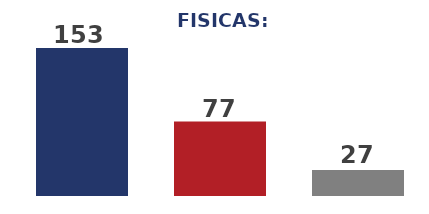
| Category | Series 0 |
|---|---|
| 0 | 153 |
| 1 | 77 |
| 2 | 27 |